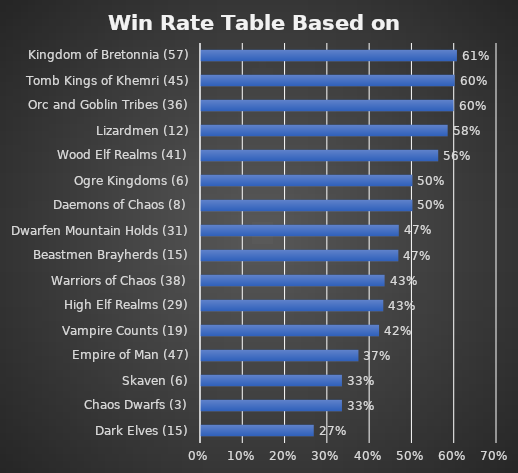
| Category | Total |
|---|---|
| Dark Elves (15) | 0.267 |
| Chaos Dwarfs (3) | 0.333 |
| Skaven (6) | 0.333 |
| Empire of Man (47) | 0.372 |
| Vampire Counts (19) | 0.421 |
| High Elf Realms (29) | 0.431 |
| Warriors of Chaos (38) | 0.434 |
| Beastmen Brayherds (15) | 0.467 |
| Dwarfen Mountain Holds (31) | 0.468 |
| Daemons of Chaos (8) | 0.5 |
| Ogre Kingdoms (6) | 0.5 |
| Wood Elf Realms (41) | 0.561 |
| Lizardmen (12) | 0.583 |
| Orc and Goblin Tribes (36) | 0.597 |
| Tomb Kings of Khemri (45) | 0.6 |
| Kingdom of Bretonnia (57) | 0.605 |